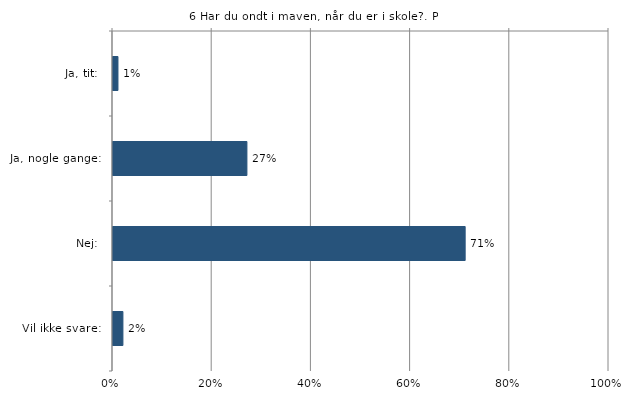
| Category | Har du ondt i maven, når du er i skole? |
|---|---|
| Ja, tit:  | 0.01 |
| Ja, nogle gange:  | 0.27 |
| Nej:  | 0.71 |
| Vil ikke svare:  | 0.02 |